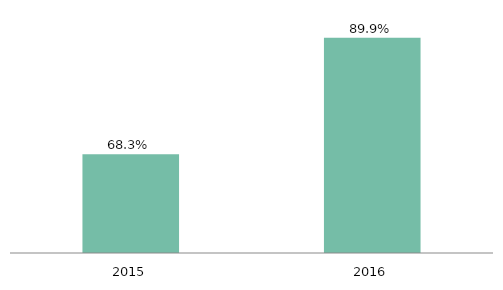
| Category | Varejo |
|---|---|
| 2015.0 | 0.683 |
| 2016.0 | 0.899 |